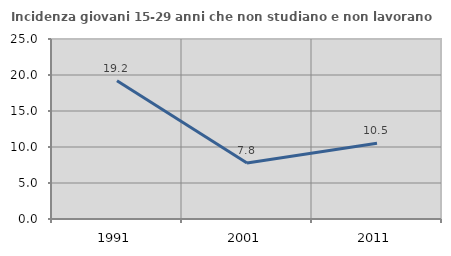
| Category | Incidenza giovani 15-29 anni che non studiano e non lavorano  |
|---|---|
| 1991.0 | 19.211 |
| 2001.0 | 7.765 |
| 2011.0 | 10.515 |